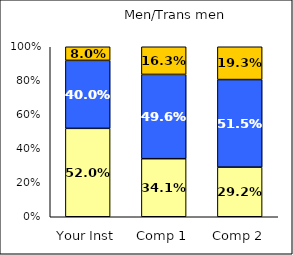
| Category | Low Job Satisfaction: Compensation | Average Job Satisfaction: Compensation | High Job Satisfaction: Compensation |
|---|---|---|---|
| Your Inst | 0.52 | 0.4 | 0.08 |
| Comp 1 | 0.341 | 0.496 | 0.163 |
| Comp 2 | 0.292 | 0.515 | 0.193 |